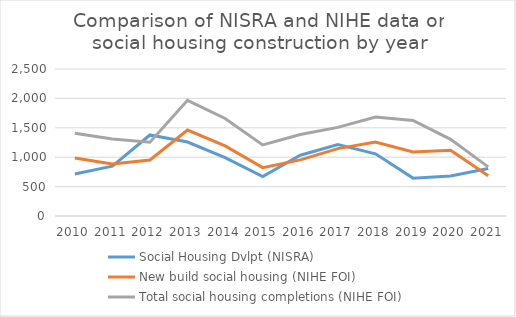
| Category | Social Housing Dvlpt (NISRA) | New build social housing (NIHE FOI) | Total social housing completions (NIHE FOI) |
|---|---|---|---|
| 2010.0 | 715 | 985 | 1409 |
| 2011.0 | 847 | 886 | 1310 |
| 2012.0 | 1378 | 953 | 1254 |
| 2013.0 | 1258 | 1462 | 1967 |
| 2014.0 | 991 | 1192 | 1658 |
| 2015.0 | 670 | 822 | 1209 |
| 2016.0 | 1033 | 955 | 1387 |
| 2017.0 | 1215 | 1146 | 1507 |
| 2018.0 | 1058 | 1259 | 1682 |
| 2019.0 | 644 | 1088 | 1626 |
| 2020.0 | 681 | 1118 | 1304 |
| 2021.0 | 807 | 684 | 836 |